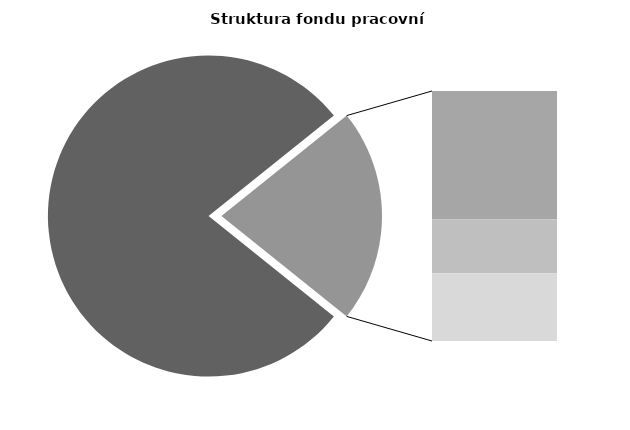
| Category | Series 0 |
|---|---|
| Průměrná měsíční odpracovaná doba bez přesčasu | 135.455 |
| Dovolená | 19.075 |
| Nemoc | 7.993 |
| Jiné | 10.039 |